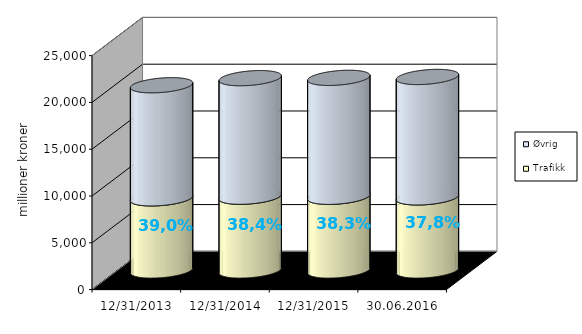
| Category | Trafikk | Øvrig |
|---|---|---|
| 31.12.2013 | 7709.892 | 12083.527 |
| 31.12.2014 | 7884.668 | 12665.925 |
| 31.12.2015 | 7875.825 | 12707.863 |
| 30.06.2016 | 7812.947 | 12865.444 |